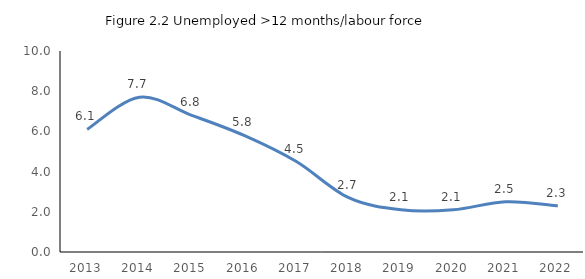
| Category | Unemployed>12 months/labour force % |
|---|---|
| 2013.0 | 6.1 |
| 2014.0 | 7.7 |
| 2015.0 | 6.8 |
| 2016.0 | 5.8 |
| 2017.0 | 4.5 |
| 2018.0 | 2.7 |
| 2019.0 | 2.1 |
| 2020.0 | 2.1 |
| 2021.0 | 2.5 |
| 2022.0 | 2.3 |